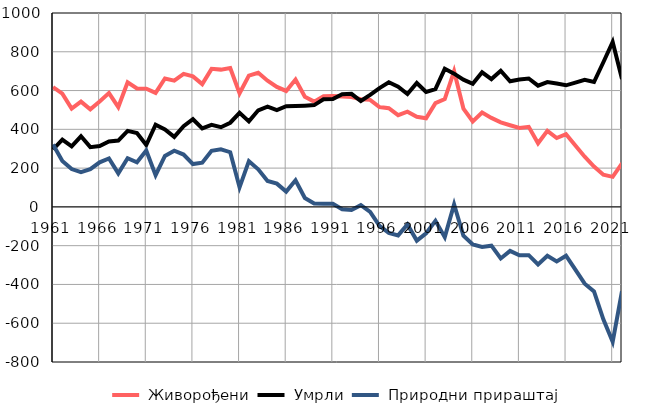
| Category |  Живорођени |  Умрли |  Природни прираштај |
|---|---|---|---|
| 1961.0 | 618 | 296 | 322 |
| 1962.0 | 584 | 347 | 237 |
| 1963.0 | 507 | 312 | 195 |
| 1964.0 | 543 | 364 | 179 |
| 1965.0 | 503 | 308 | 195 |
| 1966.0 | 544 | 314 | 230 |
| 1967.0 | 587 | 337 | 250 |
| 1968.0 | 515 | 342 | 173 |
| 1969.0 | 643 | 392 | 251 |
| 1970.0 | 611 | 381 | 230 |
| 1971.0 | 610 | 319 | 291 |
| 1972.0 | 588 | 424 | 164 |
| 1973.0 | 662 | 399 | 263 |
| 1974.0 | 651 | 361 | 290 |
| 1975.0 | 686 | 416 | 270 |
| 1976.0 | 673 | 452 | 221 |
| 1977.0 | 633 | 405 | 228 |
| 1978.0 | 712 | 423 | 289 |
| 1979.0 | 708 | 411 | 297 |
| 1980.0 | 716 | 434 | 282 |
| 1981.0 | 586 | 485 | 101 |
| 1982.0 | 677 | 441 | 236 |
| 1983.0 | 692 | 498 | 194 |
| 1984.0 | 651 | 517 | 134 |
| 1985.0 | 619 | 499 | 120 |
| 1986.0 | 598 | 519 | 79 |
| 1987.0 | 657 | 520 | 137 |
| 1988.0 | 568 | 522 | 46 |
| 1989.0 | 543 | 525 | 18 |
| 1990.0 | 571 | 555 | 16 |
| 1991.0 | 572 | 556 | 16 |
| 1992.0 | 569 | 581 | -12 |
| 1993.0 | 567 | 583 | -16 |
| 1994.0 | 555 | 546 | 9 |
| 1995.0 | 552 | 578 | -26 |
| 1996.0 | 515 | 613 | -98 |
| 1997.0 | 509 | 643 | -134 |
| 1998.0 | 473 | 620 | -147 |
| 1999.0 | 491 | 582 | -91 |
| 2000.0 | 465 | 639 | -174 |
| 2001.0 | 457 | 593 | -136 |
| 2002.0 | 535 | 607 | -72 |
| 2003.0 | 556 | 712 | -156 |
| 2004.0 | 700 | 687 | 13 |
| 2005.0 | 507 | 656 | -149 |
| 2006.0 | 441 | 635 | -194 |
| 2007.0 | 487 | 694 | -207 |
| 2008.0 | 459 | 659 | -200 |
| 2009.0 | 436 | 702 | -266 |
| 2010.0 | 421 | 648 | -227 |
| 2011.0 | 407 | 657 | -250 |
| 2012.0 | 413 | 662 | -249 |
| 2013.0 | 328 | 625 | -297 |
| 2014.0 | 392 | 644 | -252 |
| 2015.0 | 355 | 636 | -281 |
| 2016.0 | 375 | 627 | -252 |
| 2017.0 | 317 | 641 | -324 |
| 2018.0 | 259 | 655 | -396 |
| 2019.0 | 208 | 644 | -436 |
| 2020.0 | 166 | 746 | -580 |
| 2021.0 | 155 | 851 | -696 |
| 2022.0 | 225 | 660 | -435 |